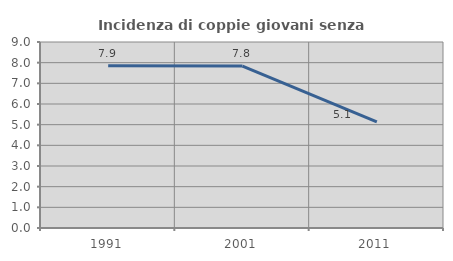
| Category | Incidenza di coppie giovani senza figli |
|---|---|
| 1991.0 | 7.852 |
| 2001.0 | 7.838 |
| 2011.0 | 5.139 |